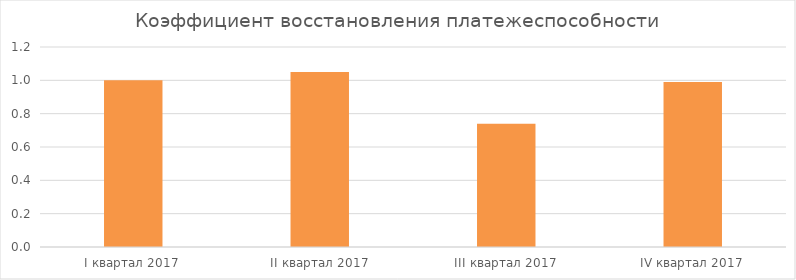
| Category | Коэффициент восстановления платежеспособности |
|---|---|
| I квартал 2017 | 1 |
| II квартал 2017 | 1.05 |
| III квартал 2017 | 0.74 |
| IV квартал 2017 | 0.99 |